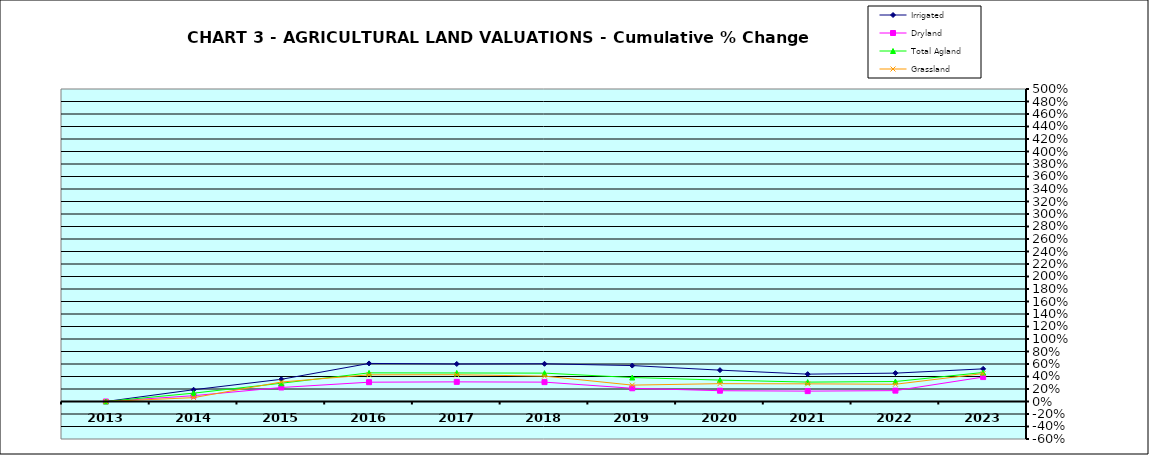
| Category | Irrigated | Dryland | Total Agland | Grassland |
|---|---|---|---|---|
| 2013.0 | 0 | 0 | 0 | 0 |
| 2014.0 | 0.188 | 0.093 | 0.134 | 0.062 |
| 2015.0 | 0.355 | 0.224 | 0.292 | 0.312 |
| 2016.0 | 0.609 | 0.309 | 0.458 | 0.427 |
| 2017.0 | 0.6 | 0.314 | 0.457 | 0.428 |
| 2018.0 | 0.603 | 0.31 | 0.454 | 0.406 |
| 2019.0 | 0.575 | 0.212 | 0.384 | 0.262 |
| 2020.0 | 0.502 | 0.173 | 0.343 | 0.285 |
| 2021.0 | 0.438 | 0.166 | 0.31 | 0.282 |
| 2022.0 | 0.454 | 0.174 | 0.32 | 0.276 |
| 2023.0 | 0.522 | 0.391 | 0.464 | 0.447 |